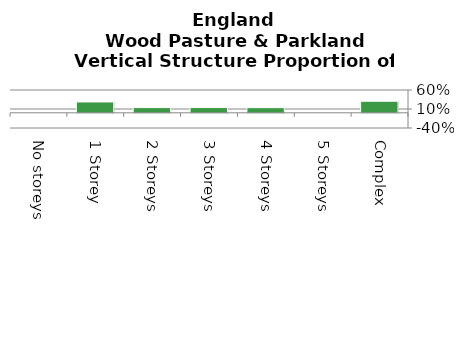
| Category | Wood Pasture & Parkland |
|---|---|
| No storeys | 0 |
| 1 Storey | 0.286 |
| 2 Storeys | 0.137 |
| 3 Storeys | 0.138 |
| 4 Storeys | 0.135 |
| 5 Storeys | 0 |
| Complex | 0.304 |